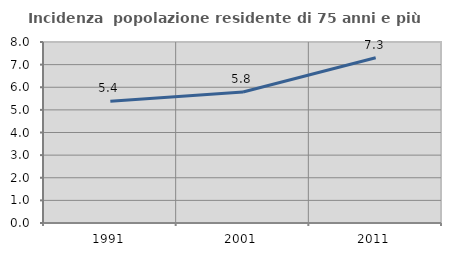
| Category | Incidenza  popolazione residente di 75 anni e più |
|---|---|
| 1991.0 | 5.383 |
| 2001.0 | 5.789 |
| 2011.0 | 7.302 |